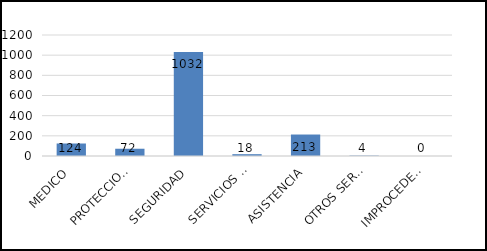
| Category | TOTAL |
|---|---|
| MEDICO | 124 |
| PROTECCION CIVIL | 72 |
| SEGURIDAD | 1032 |
| SERVICIOS PUBLICOS | 18 |
| ASISTENCIA | 213 |
| OTROS SERVICIOS | 4 |
| IMPROCEDENTES | 0 |